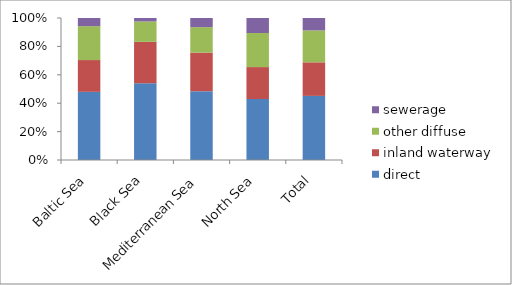
| Category | direct | inland waterway | other diffuse | sewerage |
|---|---|---|---|---|
| Baltic Sea | 63766.25 | 29739 | 31717.75 | 7626.25 |
| Black Sea | 19546.5 | 10535.75 | 5202.5 | 880.25 |
| Mediterranean Sea | 80232 | 45024.75 | 29686 | 10668.75 |
| North Sea | 240236.75 | 125896.75 | 134188.5 | 59154.5 |
| Total | 403781.5 | 211196.25 | 200794.75 | 78329.75 |